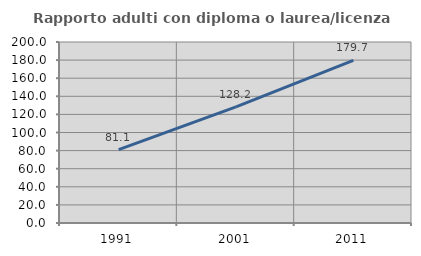
| Category | Rapporto adulti con diploma o laurea/licenza media  |
|---|---|
| 1991.0 | 81.127 |
| 2001.0 | 128.235 |
| 2011.0 | 179.661 |